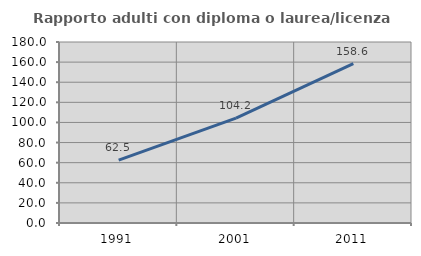
| Category | Rapporto adulti con diploma o laurea/licenza media  |
|---|---|
| 1991.0 | 62.475 |
| 2001.0 | 104.219 |
| 2011.0 | 158.588 |